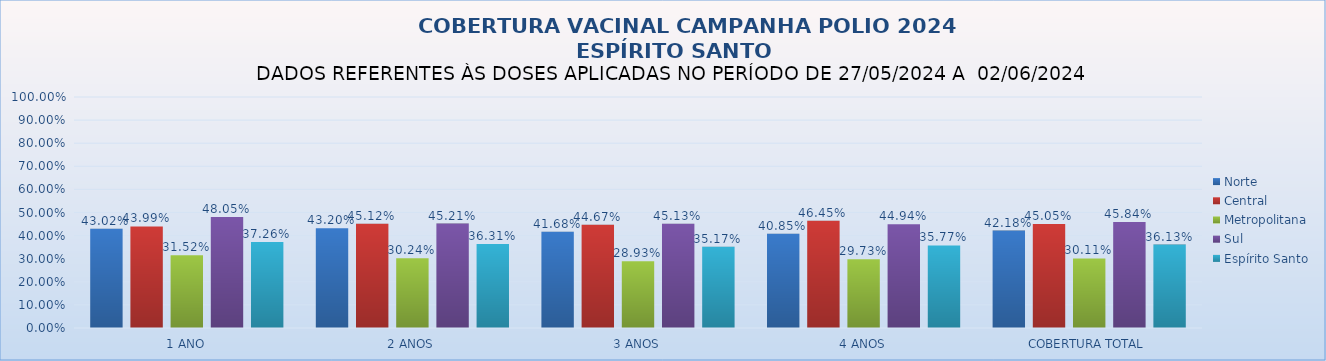
| Category | Norte | Central | Metropolitana | Sul | Espírito Santo |
|---|---|---|---|---|---|
| 1 ANO | 0.43 | 0.44 | 0.315 | 0.48 | 0.373 |
| 2 ANOS | 0.432 | 0.451 | 0.302 | 0.452 | 0.363 |
| 3 ANOS | 0.417 | 0.447 | 0.289 | 0.451 | 0.352 |
| 4 ANOS | 0.409 | 0.465 | 0.297 | 0.449 | 0.358 |
| COBERTURA TOTAL | 0.422 | 0.45 | 0.301 | 0.458 | 0.361 |